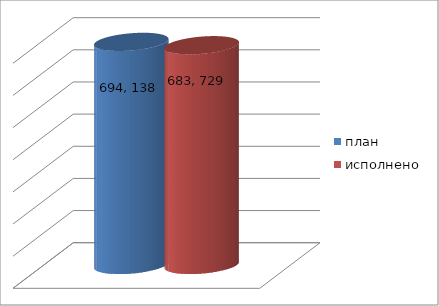
| Category | план | исполнено |
|---|---|---|
| 0 | 694138943.52 | 683729489.81 |